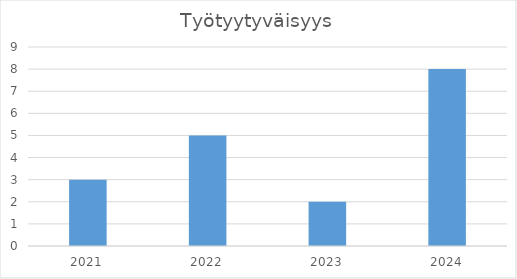
| Category | Työtyytyväisyys |
|---|---|
| 2021.0 | 3 |
| 2022.0 | 5 |
| 2023.0 | 2 |
| 2024.0 | 8 |